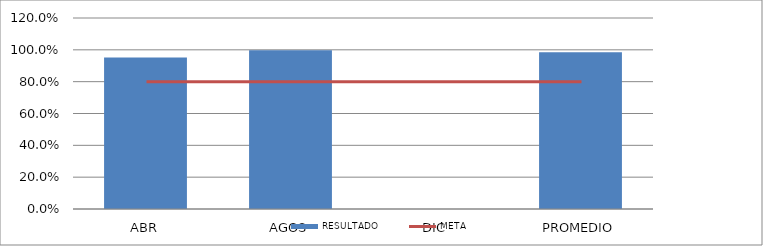
| Category | RESULTADO |
|---|---|
| ABR | 0.952 |
| AGOS | 0.997 |
| DIC | 0 |
| PROMEDIO | 0.985 |